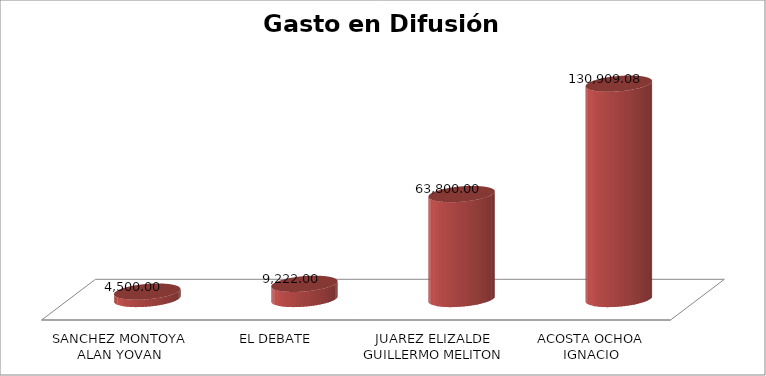
| Category | Suma  |
|---|---|
| SANCHEZ MONTOYA ALAN YOVAN | 4500 |
| EL DEBATE | 9222 |
| JUAREZ ELIZALDE GUILLERMO MELITON | 63800 |
| ACOSTA OCHOA IGNACIO | 130909.08 |